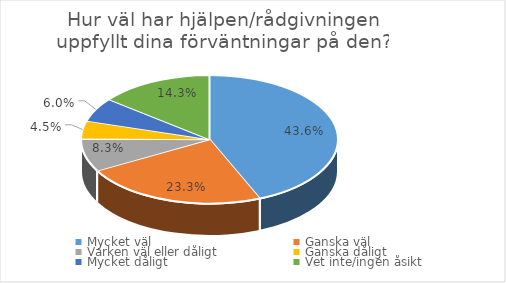
| Category | Series 0 |
|---|---|
| Mycket väl | 0.436 |
| Ganska väl | 0.233 |
| Varken väl eller dåligt | 0.083 |
| Ganska dåligt  | 0.045 |
| Mycket dåligt  | 0.06 |
| Vet inte/ingen åsikt | 0.143 |